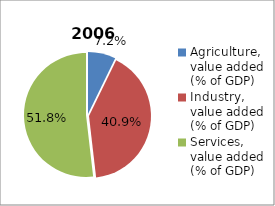
| Category | 2006 |
|---|---|
| Agriculture, value added (% of GDP)  | 7.219 |
| Industry, value added (% of GDP) | 40.947 |
| Services, value added (% of GDP) | 51.834 |